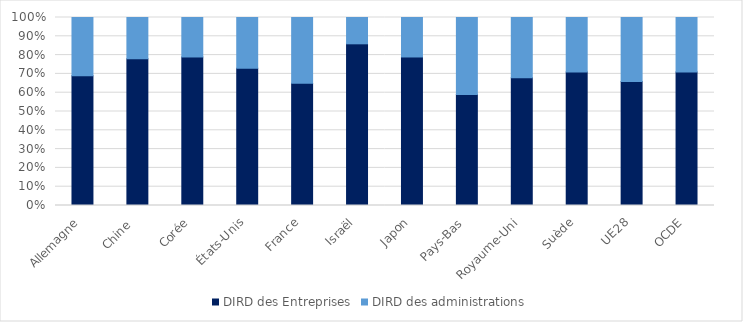
| Category | DIRD des Entreprises | DIRD des administrations |
|---|---|---|
| Allemagne | 0.69 | 0.31 |
| Chine  | 0.78 | 0.22 |
| Corée | 0.79 | 0.21 |
| États-Unis | 0.73 | 0.27 |
| France | 0.65 | 0.35 |
| Israël | 0.86 | 0.14 |
| Japon | 0.79 | 0.21 |
| Pays-Bas | 0.59 | 0.41 |
| Royaume-Uni | 0.68 | 0.32 |
| Suède | 0.71 | 0.29 |
| UE28 | 0.66 | 0.34 |
| OCDE | 0.71 | 0.29 |